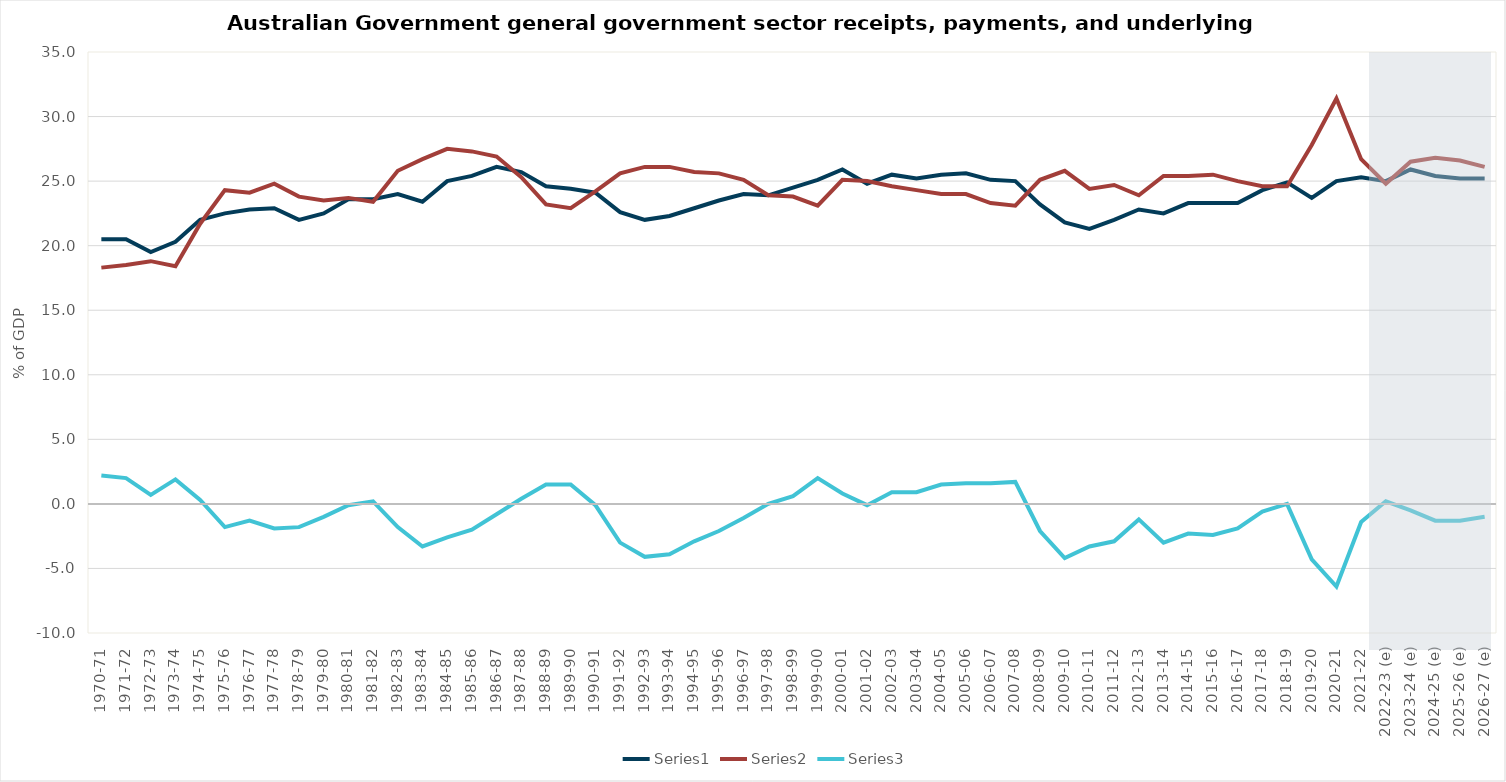
| Category | Series 0 | Series 1 | Series 2 |
|---|---|---|---|
| 1970-71 | 20.5 | 18.3 | 2.2 |
| 1971-72 | 20.5 | 18.5 | 2 |
| 1972-73 | 19.5 | 18.8 | 0.7 |
| 1973-74 | 20.3 | 18.4 | 1.9 |
| 1974-75 | 22 | 21.7 | 0.3 |
| 1975-76 | 22.5 | 24.3 | -1.8 |
| 1976-77 | 22.8 | 24.1 | -1.3 |
| 1977-78 | 22.9 | 24.8 | -1.9 |
| 1978-79 | 22 | 23.8 | -1.8 |
| 1979-80 | 22.5 | 23.5 | -1 |
| 1980-81 | 23.6 | 23.7 | -0.1 |
| 1981-82 | 23.6 | 23.4 | 0.2 |
| 1982-83 | 24 | 25.8 | -1.8 |
| 1983-84 | 23.4 | 26.7 | -3.3 |
| 1984-85 | 25 | 27.5 | -2.6 |
| 1985-86 | 25.4 | 27.3 | -2 |
| 1986-87 | 26.1 | 26.9 | -0.8 |
| 1987-88 | 25.7 | 25.3 | 0.4 |
| 1988-89 | 24.6 | 23.2 | 1.5 |
| 1989-90 | 24.4 | 22.9 | 1.5 |
| 1990-91 | 24.1 | 24.2 | -0.1 |
| 1991-92 | 22.6 | 25.6 | -3 |
| 1992-93 | 22 | 26.1 | -4.1 |
| 1993-94 | 22.3 | 26.1 | -3.9 |
| 1994-95 | 22.9 | 25.7 | -2.9 |
| 1995-96 | 23.5 | 25.6 | -2.1 |
| 1996-97 | 24 | 25.1 | -1.1 |
| 1997-98 | 23.9 | 23.9 | 0 |
| 1998-99 | 24.5 | 23.8 | 0.6 |
| 1999-00 | 25.1 | 23.1 | 2 |
| 2000-01 | 25.9 | 25.1 | 0.8 |
| 2001-02 | 24.8 | 25 | -0.1 |
| 2002-03 | 25.5 | 24.6 | 0.9 |
| 2003-04 | 25.2 | 24.3 | 0.9 |
| 2004-05 | 25.5 | 24 | 1.5 |
| 2005-06 | 25.6 | 24 | 1.6 |
| 2006-07 | 25.1 | 23.3 | 1.6 |
| 2007-08 | 25 | 23.1 | 1.7 |
| 2008-09 | 23.2 | 25.1 | -2.1 |
| 2009-10 | 21.8 | 25.8 | -4.2 |
| 2010-11 | 21.3 | 24.4 | -3.3 |
| 2011-12 | 22 | 24.7 | -2.9 |
| 2012-13 | 22.8 | 23.9 | -1.2 |
| 2013-14 | 22.5 | 25.4 | -3 |
| 2014-15 | 23.3 | 25.4 | -2.3 |
| 2015-16 | 23.3 | 25.5 | -2.4 |
| 2016-17 | 23.3 | 25 | -1.9 |
| 2017-18 | 24.3 | 24.6 | -0.6 |
| 2018-19 | 24.9 | 24.6 | 0 |
| 2019-20 | 23.7 | 27.8 | -4.3 |
| 2020-21 | 25 | 31.4 | -6.4 |
| 2021-22 | 25.3 | 26.7 | -1.4 |
| 2022-23 (e) | 25 | 24.8 | 0.2 |
| 2023-24 (e) | 25.9 | 26.5 | -0.5 |
| 2024-25 (e) | 25.4 | 26.8 | -1.3 |
| 2025-26 (e) | 25.2 | 26.6 | -1.3 |
| 2026-27 (e) | 25.2 | 26.1 | -1 |